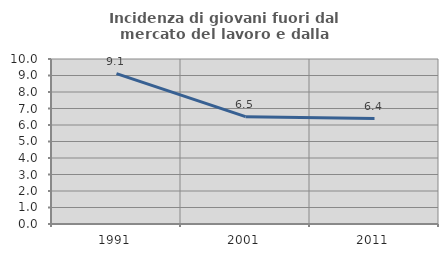
| Category | Incidenza di giovani fuori dal mercato del lavoro e dalla formazione  |
|---|---|
| 1991.0 | 9.116 |
| 2001.0 | 6.503 |
| 2011.0 | 6.394 |